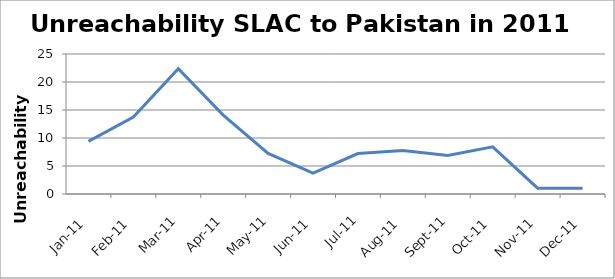
| Category | Unreachability |
|---|---|
| 2011-12-01 | 1.042 |
| 2011-11-01 | 1.042 |
| 2011-10-01 | 8.42 |
| 2011-09-01 | 6.897 |
| 2011-08-01 | 7.78 |
| 2011-07-01 | 7.217 |
| 2011-06-01 | 3.736 |
| 2011-05-01 | 7.234 |
| 2011-04-01 | 14.087 |
| 2011-03-01 | 22.378 |
| 2011-02-01 | 13.735 |
| 2011-01-01 | 9.409 |